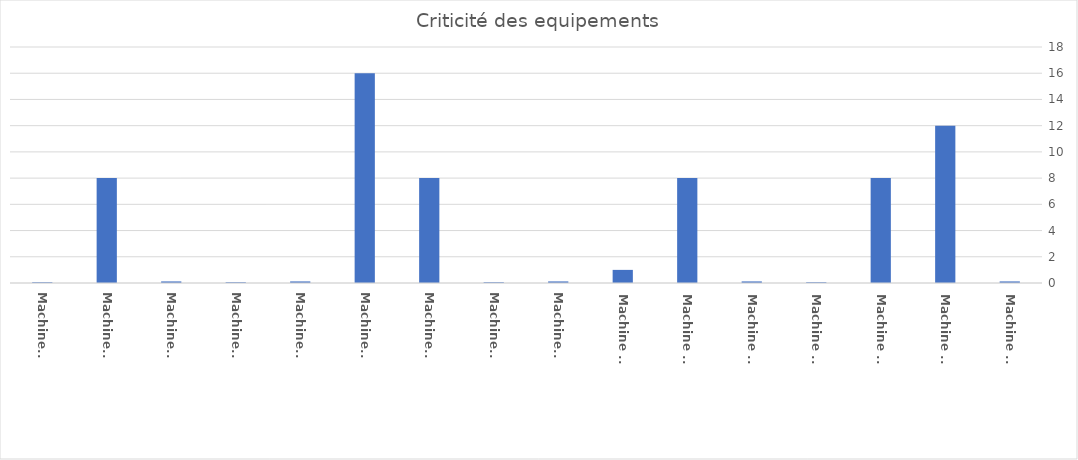
| Category | Series 0 |
|---|---|
| Machine 1 | 0.06 |
| Machine 2 | 8 |
| Machine 3 | 0.12 |
| Machine 4 | 0.06 |
| Machine 5 | 0.12 |
| Machine 6 | 16 |
| Machine 7 | 8 |
| Machine 8 | 0.06 |
| Machine 9 | 0.12 |
| Machine 10 | 1 |
| Machine 11 | 8 |
| Machine 12 | 0.12 |
| Machine 13 | 0.06 |
| Machine 14 | 8 |
| Machine 15 | 12 |
| Machine 16 | 0.12 |